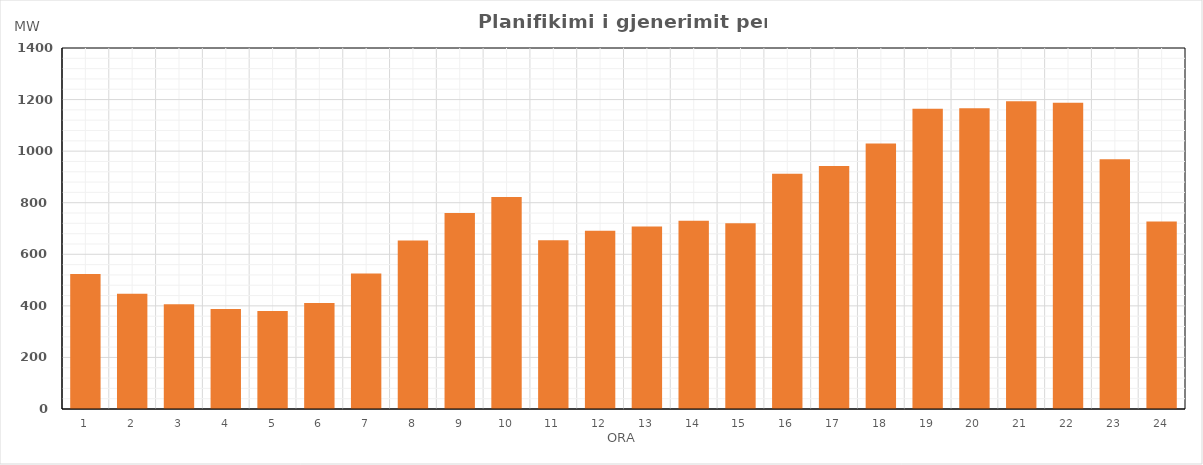
| Category | Max (MW) |
|---|---|
| 0 | 523.53 |
| 1 | 446.93 |
| 2 | 406.12 |
| 3 | 387.92 |
| 4 | 379.89 |
| 5 | 411.38 |
| 6 | 525.72 |
| 7 | 653.92 |
| 8 | 760.59 |
| 9 | 822.53 |
| 10 | 654.06 |
| 11 | 690.87 |
| 12 | 708.14 |
| 13 | 730.41 |
| 14 | 720.25 |
| 15 | 912.76 |
| 16 | 942.62 |
| 17 | 1029.76 |
| 18 | 1164.51 |
| 19 | 1166.49 |
| 20 | 1193.36 |
| 21 | 1187.94 |
| 22 | 968.47 |
| 23 | 727.45 |